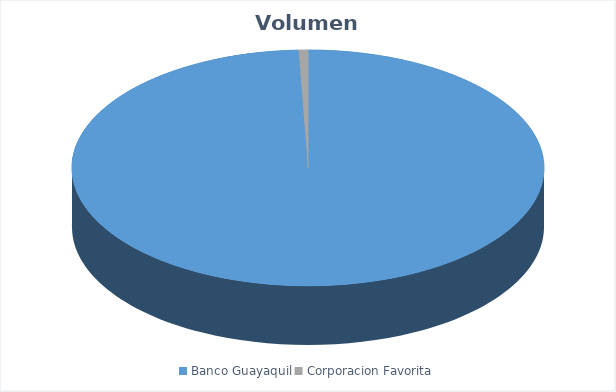
| Category | VOLUMEN ($USD) |
|---|---|
| Banco Guayaquil | 31591 |
| Corporacion Favorita | 202.5 |